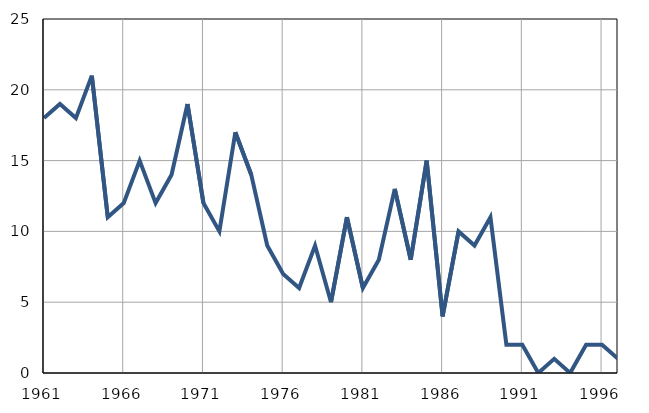
| Category | Infants
deaths |
|---|---|
| 1961.0 | 18 |
| 1962.0 | 19 |
| 1963.0 | 18 |
| 1964.0 | 21 |
| 1965.0 | 11 |
| 1966.0 | 12 |
| 1967.0 | 15 |
| 1968.0 | 12 |
| 1969.0 | 14 |
| 1970.0 | 19 |
| 1971.0 | 12 |
| 1972.0 | 10 |
| 1973.0 | 17 |
| 1974.0 | 14 |
| 1975.0 | 9 |
| 1976.0 | 7 |
| 1977.0 | 6 |
| 1978.0 | 9 |
| 1979.0 | 5 |
| 1980.0 | 11 |
| 1981.0 | 6 |
| 1982.0 | 8 |
| 1983.0 | 13 |
| 1984.0 | 8 |
| 1985.0 | 15 |
| 1986.0 | 4 |
| 1987.0 | 10 |
| 1988.0 | 9 |
| 1989.0 | 11 |
| 1990.0 | 2 |
| 1991.0 | 2 |
| 1992.0 | 0 |
| 1993.0 | 1 |
| 1994.0 | 0 |
| 1995.0 | 2 |
| 1996.0 | 2 |
| 1997.0 | 1 |